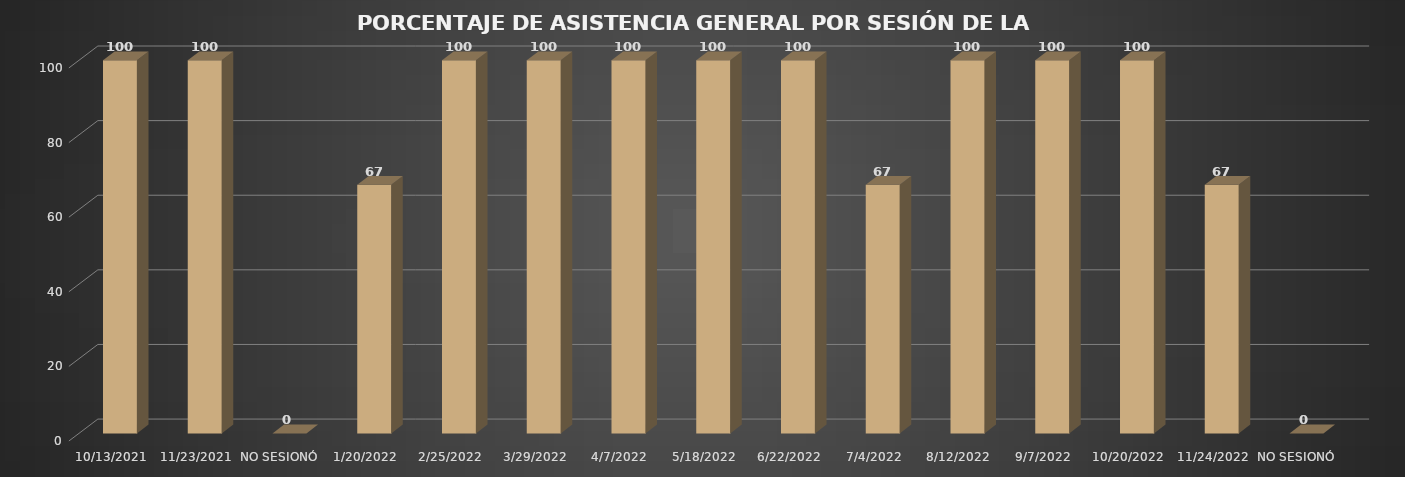
| Category | Series 0 |
|---|---|
| 13/10/2021 | 100 |
| 23/11/2021 | 100 |
| NO SESIONÓ | 0 |
| 20/01/2022 | 66.667 |
| 25/02/2022 | 100 |
| 29/03/2022 | 100 |
| 07/04/2022 | 100 |
| 18/05/2022 | 100 |
| 22/06/2022 | 100 |
| 04/07/2022 | 66.667 |
| 12/08/2022 | 100 |
| 07/09/2022 | 100 |
| 20/10/2022 | 100 |
| 24/11/2022 | 66.667 |
| NO SESIONÓ | 0 |